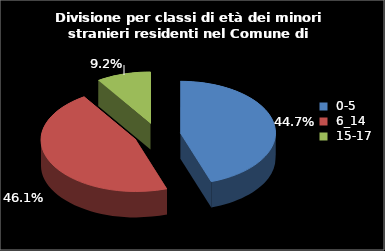
| Category | Series 0 |
|---|---|
| 0-5 | 34 |
| 6_14 | 35 |
| 15-17 | 7 |